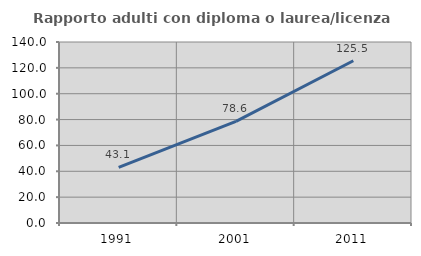
| Category | Rapporto adulti con diploma o laurea/licenza media  |
|---|---|
| 1991.0 | 43.088 |
| 2001.0 | 78.571 |
| 2011.0 | 125.493 |